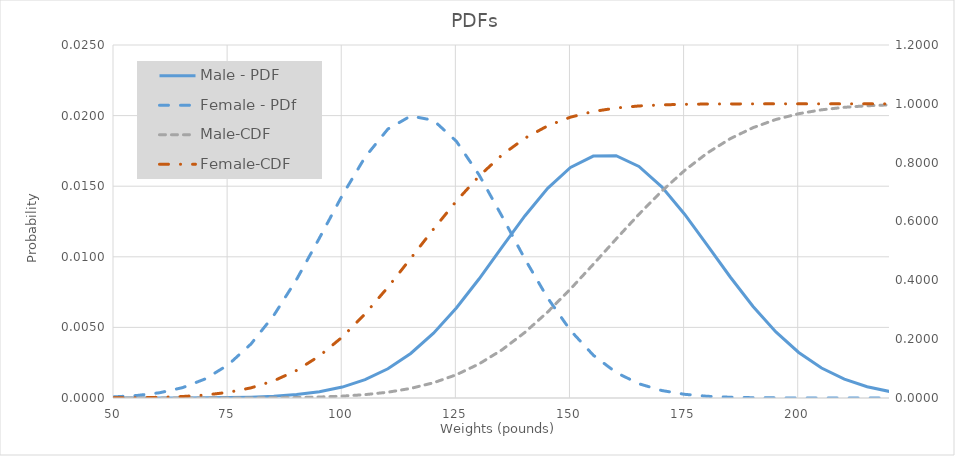
| Category | Male - PDF | Female - PDf |
|---|---|---|
| 50.0 | 0 | 0 |
| 55.0 | 0 | 0 |
| 60.0 | 0 | 0 |
| 65.0 | 0 | 0.001 |
| 70.0 | 0 | 0.001 |
| 75.0 | 0 | 0.002 |
| 80.0 | 0 | 0.004 |
| 85.0 | 0 | 0.006 |
| 90.0 | 0 | 0.008 |
| 95.0 | 0 | 0.011 |
| 100.0 | 0.001 | 0.014 |
| 105.0 | 0.001 | 0.017 |
| 110.0 | 0.002 | 0.019 |
| 115.0 | 0.003 | 0.02 |
| 120.0 | 0.005 | 0.02 |
| 125.0 | 0.006 | 0.018 |
| 130.0 | 0.008 | 0.016 |
| 135.0 | 0.011 | 0.013 |
| 140.0 | 0.013 | 0.01 |
| 145.0 | 0.015 | 0.007 |
| 150.0 | 0.016 | 0.005 |
| 155.0 | 0.017 | 0.003 |
| 160.0 | 0.017 | 0.002 |
| 165.0 | 0.016 | 0.001 |
| 170.0 | 0.015 | 0.001 |
| 175.0 | 0.013 | 0 |
| 180.0 | 0.011 | 0 |
| 185.0 | 0.009 | 0 |
| 190.0 | 0.006 | 0 |
| 195.0 | 0.005 | 0 |
| 200.0 | 0.003 | 0 |
| 205.0 | 0.002 | 0 |
| 210.0 | 0.001 | 0 |
| 215.0 | 0.001 | 0 |
| 220.0 | 0 | 0 |